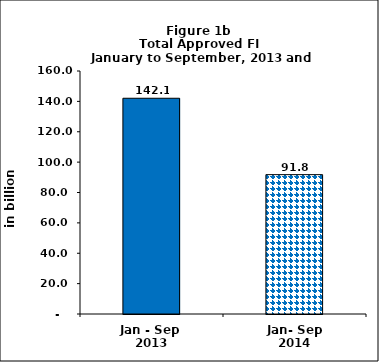
| Category | Series 0 |
|---|---|
| Jan - Sep 
2013 | 142.054 |
| Jan- Sep
2014 | 91.757 |